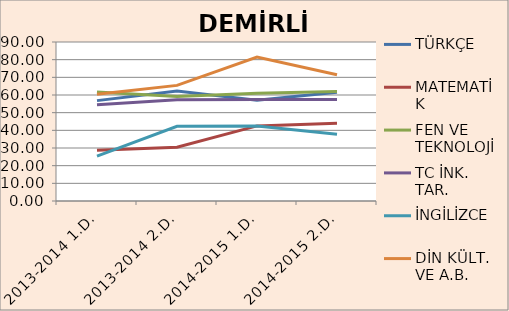
| Category | TÜRKÇE | MATEMATİK | FEN VE TEKNOLOJİ | TC İNK. TAR. | İNGİLİZCE | DİN KÜLT. VE A.B. |
|---|---|---|---|---|---|---|
| 2013-2014 1.D. | 56.82 | 28.73 | 61.67 | 54.55 | 25.45 | 60.45 |
| 2013-2014 2.D. | 62.27 | 30.45 | 59.09 | 57.27 | 42.27 | 65.45 |
| 2014-2015 1.D. | 57 | 42.5 | 61 | 57.5 | 42.5 | 81.5 |
| 2014-2015 2.D. | 61.5 | 44 | 62 | 57.5 | 37.78 | 71.5 |